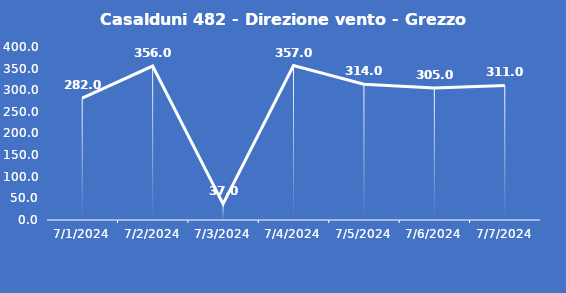
| Category | Casalduni 482 - Direzione vento - Grezzo (°N) |
|---|---|
| 7/1/24 | 282 |
| 7/2/24 | 356 |
| 7/3/24 | 37 |
| 7/4/24 | 357 |
| 7/5/24 | 314 |
| 7/6/24 | 305 |
| 7/7/24 | 311 |